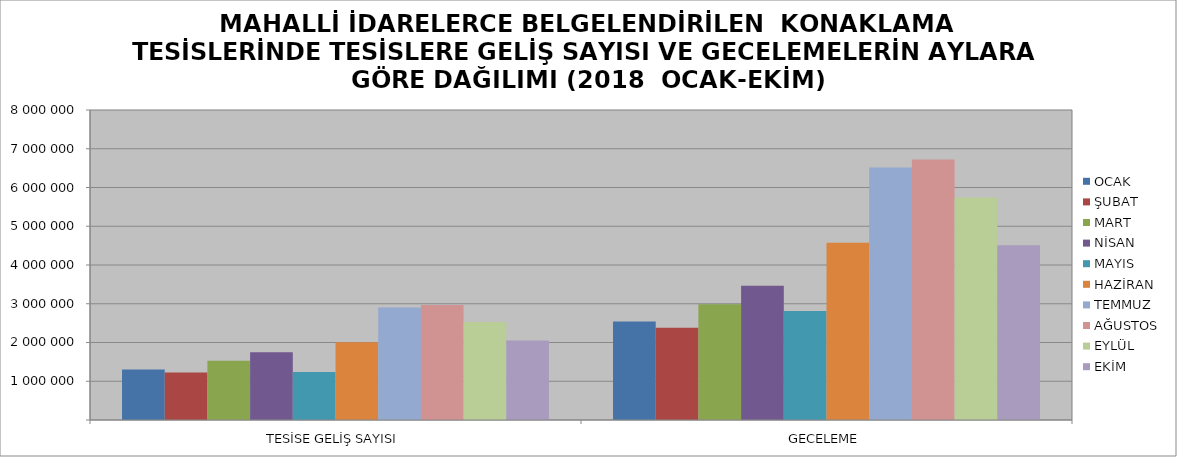
| Category | OCAK | ŞUBAT | MART | NİSAN | MAYIS | HAZİRAN | TEMMUZ | AĞUSTOS | EYLÜL | EKİM |
|---|---|---|---|---|---|---|---|---|---|---|
| TESİSE GELİŞ SAYISI | 1303353 | 1223475 | 1526172 | 1749085 | 1240889 | 2003881 | 2904028 | 2966995 | 2525986 | 2049336 |
| GECELEME | 2542103 | 2381300 | 2986820 | 3463261 | 2810808 | 4572629 | 6517690 | 6721558 | 5740112 | 4508357 |